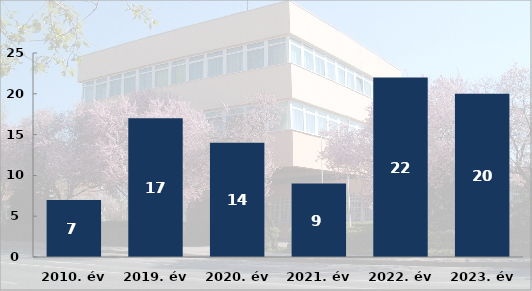
| Category | Személysérüléses közúti közlekedési baleset során meghalt, illetve megsérült személyek száma (fő) |
|---|---|
| 2010. év | 7 |
| 2019. év | 17 |
| 2020. év | 14 |
| 2021. év | 9 |
| 2022. év | 22 |
| 2023. év | 20 |